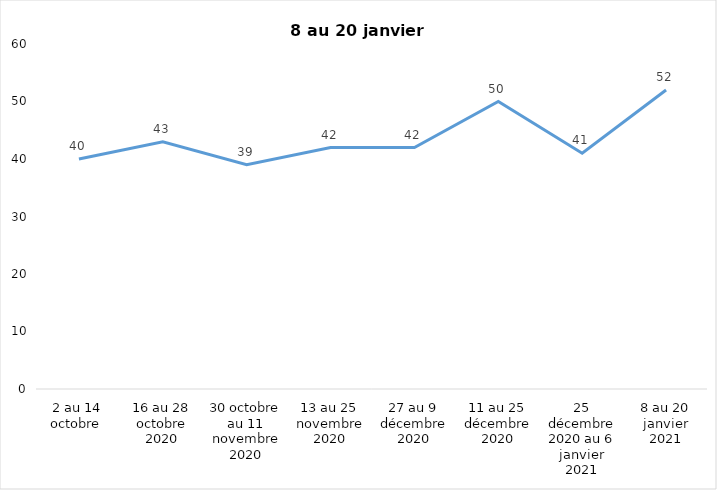
| Category | Toujours aux trois mesures |
|---|---|
| 2 au 14 octobre  | 40 |
| 16 au 28 octobre 2020 | 43 |
| 30 octobre au 11 novembre 2020 | 39 |
| 13 au 25 novembre 2020 | 42 |
| 27 au 9 décembre 2020 | 42 |
| 11 au 25 décembre 2020 | 50 |
| 25 décembre 2020 au 6 janvier 2021 | 41 |
| 8 au 20 janvier 2021 | 52 |